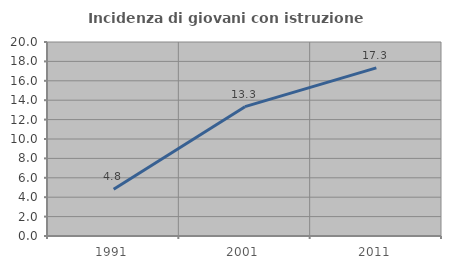
| Category | Incidenza di giovani con istruzione universitaria |
|---|---|
| 1991.0 | 4.819 |
| 2001.0 | 13.333 |
| 2011.0 | 17.333 |